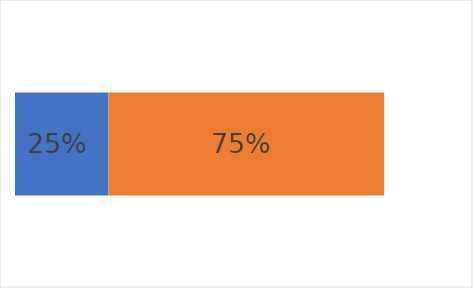
| Category | Так | Ні  |
|---|---|---|
| 0 | 0.253 | 0.747 |